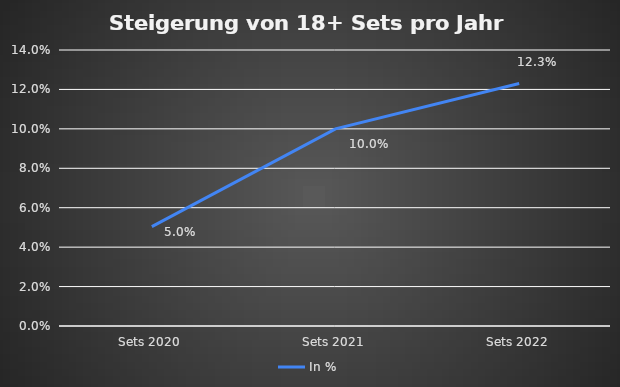
| Category | In % |
|---|---|
| Sets 2020 | 0.05 |
| Sets 2021 | 0.1 |
| Sets 2022 | 0.123 |